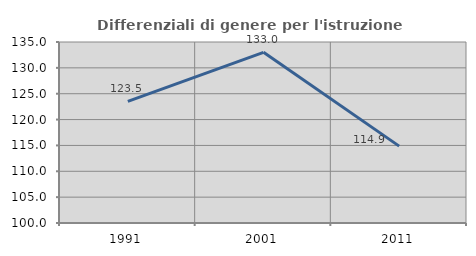
| Category | Differenziali di genere per l'istruzione superiore |
|---|---|
| 1991.0 | 123.53 |
| 2001.0 | 133.003 |
| 2011.0 | 114.865 |